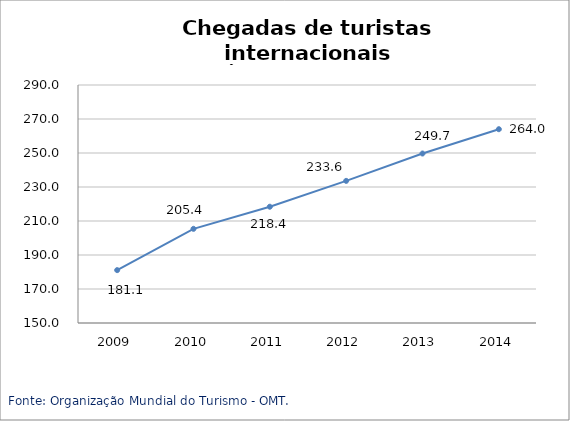
| Category | Ásia e Pacífico |
|---|---|
| 2009.0 | 181.1 |
| 2010.0 | 205.4 |
| 2011.0 | 218.4 |
| 2012.0 | 233.6 |
| 2013.0 | 249.7 |
| 2014.0 | 264 |